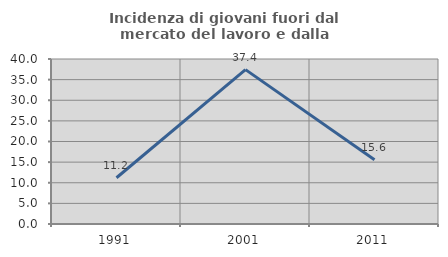
| Category | Incidenza di giovani fuori dal mercato del lavoro e dalla formazione  |
|---|---|
| 1991.0 | 11.217 |
| 2001.0 | 37.425 |
| 2011.0 | 15.556 |